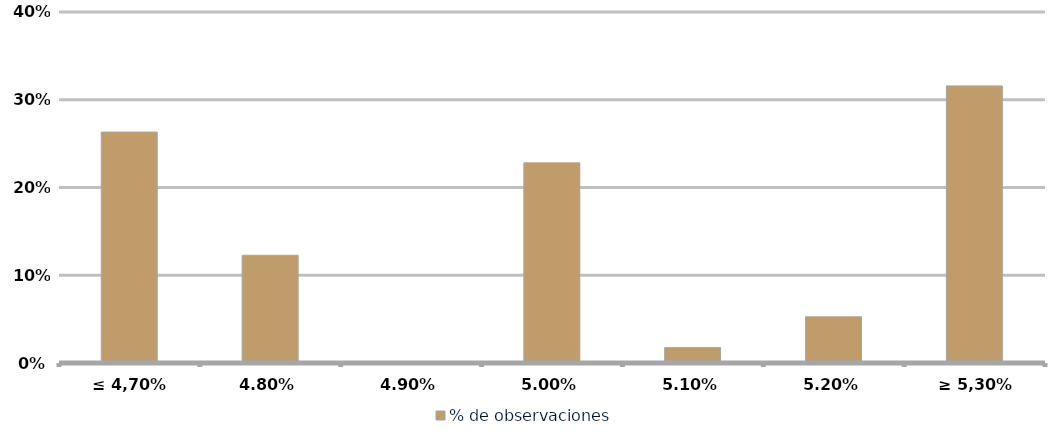
| Category | % de observaciones  |
|---|---|
| ≤ 4,70% | 0.263 |
| 4,80% | 0.123 |
| 4,90% | 0 |
| 5,00% | 0.228 |
| 5,10% | 0.018 |
| 5,20% | 0.053 |
| ≥ 5,30% | 0.316 |